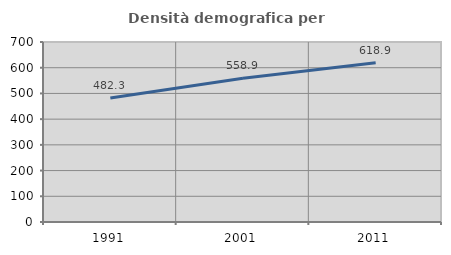
| Category | Densità demografica |
|---|---|
| 1991.0 | 482.251 |
| 2001.0 | 558.856 |
| 2011.0 | 618.9 |